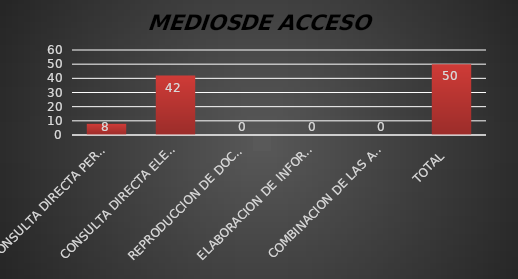
| Category | Series 1 |
|---|---|
| CONSULTA DIRECTA PERSONAL | 8 |
| CONSULTA DIRECTA ELECTRONICA | 42 |
| REPRODUCCION DE DOCUMENTOS  | 0 |
| ELABORACION DE INFORMES ESPECIFICOS  | 0 |
| COMBINACION DE LAS ANTERIORES | 0 |
| TOTAL  | 50 |